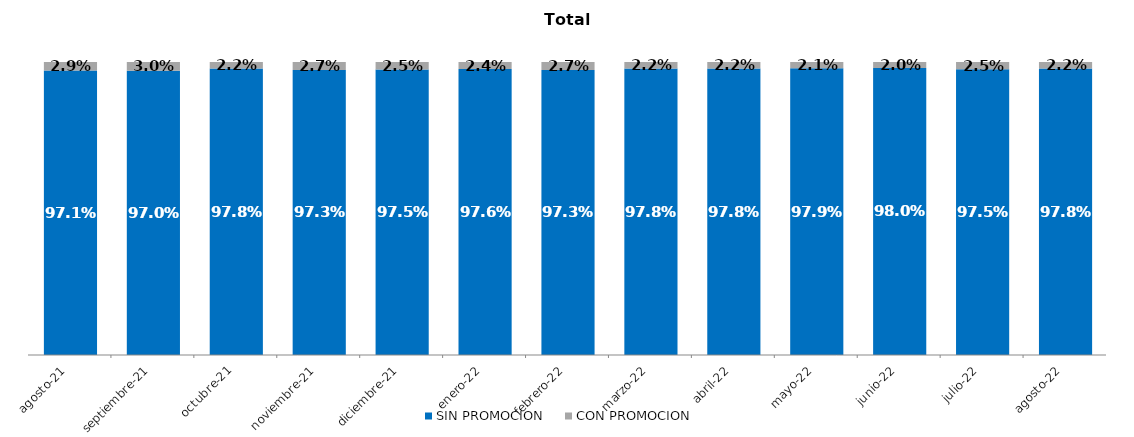
| Category | SIN PROMOCION   | CON PROMOCION   |
|---|---|---|
| 2021-08-01 | 0.971 | 0.029 |
| 2021-09-01 | 0.97 | 0.03 |
| 2021-10-01 | 0.978 | 0.022 |
| 2021-11-01 | 0.973 | 0.027 |
| 2021-12-01 | 0.975 | 0.025 |
| 2022-01-01 | 0.976 | 0.024 |
| 2022-02-01 | 0.973 | 0.027 |
| 2022-03-01 | 0.978 | 0.022 |
| 2022-04-01 | 0.978 | 0.022 |
| 2022-05-01 | 0.979 | 0.021 |
| 2022-06-01 | 0.98 | 0.02 |
| 2022-07-01 | 0.975 | 0.025 |
| 2022-08-01 | 0.978 | 0.022 |